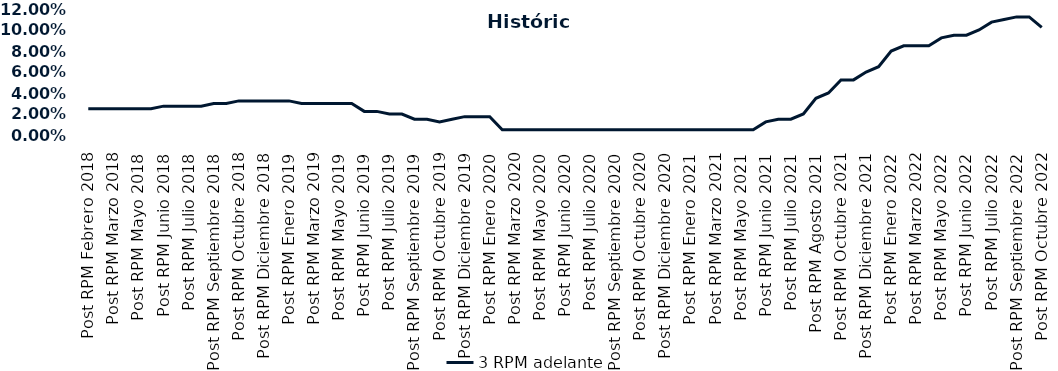
| Category | 3 RPM adelante |
|---|---|
| Post RPM Febrero 2018 | 0.025 |
| Pre RPM Marzo 2018 | 0.025 |
| Post RPM Marzo 2018 | 0.025 |
| Pre RPM Mayo 2018 | 0.025 |
| Post RPM Mayo 2018 | 0.025 |
| Pre RPM Junio 2018 | 0.025 |
| Post RPM Junio 2018 | 0.028 |
| Pre RPM Julio 2018 | 0.028 |
| Post RPM Julio 2018 | 0.028 |
| Pre RPM Septiembre 2018 | 0.028 |
| Post RPM Septiembre 2018 | 0.03 |
| Pre RPM Octubre 2018 | 0.03 |
| Post RPM Octubre 2018 | 0.032 |
| Pre RPM Diciembre 2018 | 0.032 |
| Post RPM Diciembre 2018 | 0.032 |
| Pre RPM Enero 2019 | 0.032 |
| Post RPM Enero 2019 | 0.032 |
| Pre RPM Marzo 2019 | 0.03 |
| Post RPM Marzo 2019 | 0.03 |
| Pre RPM Mayo 2019 | 0.03 |
| Post RPM Mayo 2019 | 0.03 |
| Pre RPM Junio 2019 | 0.03 |
| Post RPM Junio 2019 | 0.022 |
| Pre RPM Julio 2019 | 0.022 |
| Post RPM Julio 2019 | 0.02 |
| Pre RPM Septiembre 2019 | 0.02 |
| Post RPM Septiembre 2019 | 0.015 |
| Pre RPM Octubre 2019 | 0.015 |
| Post RPM Octubre 2019 | 0.012 |
| Pre RPM Diciembre 2019 | 0.015 |
| Post RPM Diciembre 2019 | 0.018 |
| Pre RPM Enero 2020 | 0.018 |
| Post RPM Enero 2020 | 0.018 |
| Pre RPM Marzo 2020 | 0.005 |
| Post RPM Marzo 2020 | 0.005 |
| Pre RPM Mayo 2020 | 0.005 |
| Post RPM Mayo 2020 | 0.005 |
| Pre RPM Junio 2020 | 0.005 |
| Post RPM Junio 2020 | 0.005 |
| Pre RPM Julio 2020 | 0.005 |
| Post RPM Julio 2020 | 0.005 |
| Pre RPM Septiembre 2020 | 0.005 |
| Post RPM Septiembre 2020 | 0.005 |
| Pre RPM Octubre 2020 | 0.005 |
| Post RPM Octubre 2020 | 0.005 |
| Pre RPM Diciembre 2020 | 0.005 |
| Post RPM Diciembre 2020 | 0.005 |
| Pre RPM Enero 2021 | 0.005 |
| Post RPM Enero 2021 | 0.005 |
| Pre RPM Marzo 2021 | 0.005 |
| Post RPM Marzo 2021 | 0.005 |
| Pre RPM Mayo 2021 | 0.005 |
| Post RPM Mayo 2021 | 0.005 |
| Pre RPM Junio 2021 | 0.005 |
| Post RPM Junio 2021 | 0.012 |
| Pre RPM Julio 2021 | 0.015 |
| Post RPM Julio 2021 | 0.015 |
| Pre RPM Agosto 2021 | 0.02 |
| Post RPM Agosto 2021 | 0.035 |
| Pre RPM Octubre 2021 | 0.04 |
| Post RPM Octubre 2021 | 0.052 |
| Pre RPM Diciembre 2021 | 0.052 |
| Post RPM Diciembre 2021 | 0.06 |
| Pre RPM Enero 2022 | 0.065 |
| Post RPM Enero 2022 | 0.08 |
| Pre RPM Marzo 2022 | 0.085 |
| Post RPM Marzo 2022 | 0.085 |
| Pre RPM Mayo 2022 | 0.085 |
| Post RPM Mayo 2022 | 0.092 |
| Pre RPM Junio 2022 | 0.095 |
| Post RPM Junio 2022 | 0.095 |
| Pre RPM Julio 2022 | 0.1 |
| Post RPM Julio 2022 | 0.108 |
| Pre RPM Septiembre 2022 | 0.11 |
| Post RPM Septiembre 2022 | 0.112 |
| Pre RPM Octubre 2022 | 0.112 |
| Post RPM Octubre 2022 | 0.102 |